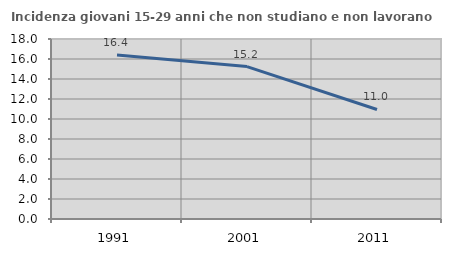
| Category | Incidenza giovani 15-29 anni che non studiano e non lavorano  |
|---|---|
| 1991.0 | 16.396 |
| 2001.0 | 15.24 |
| 2011.0 | 10.951 |